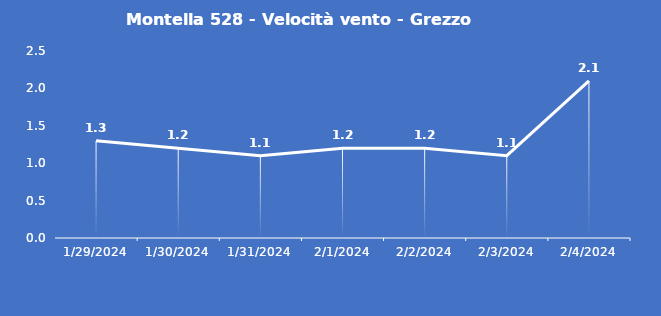
| Category | Montella 528 - Velocità vento - Grezzo (m/s) |
|---|---|
| 1/29/24 | 1.3 |
| 1/30/24 | 1.2 |
| 1/31/24 | 1.1 |
| 2/1/24 | 1.2 |
| 2/2/24 | 1.2 |
| 2/3/24 | 1.1 |
| 2/4/24 | 2.1 |